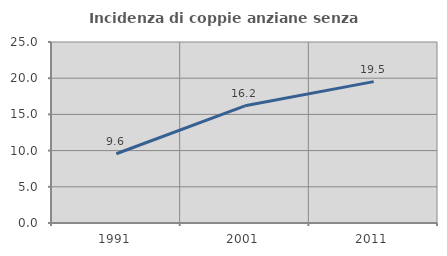
| Category | Incidenza di coppie anziane senza figli  |
|---|---|
| 1991.0 | 9.563 |
| 2001.0 | 16.187 |
| 2011.0 | 19.53 |